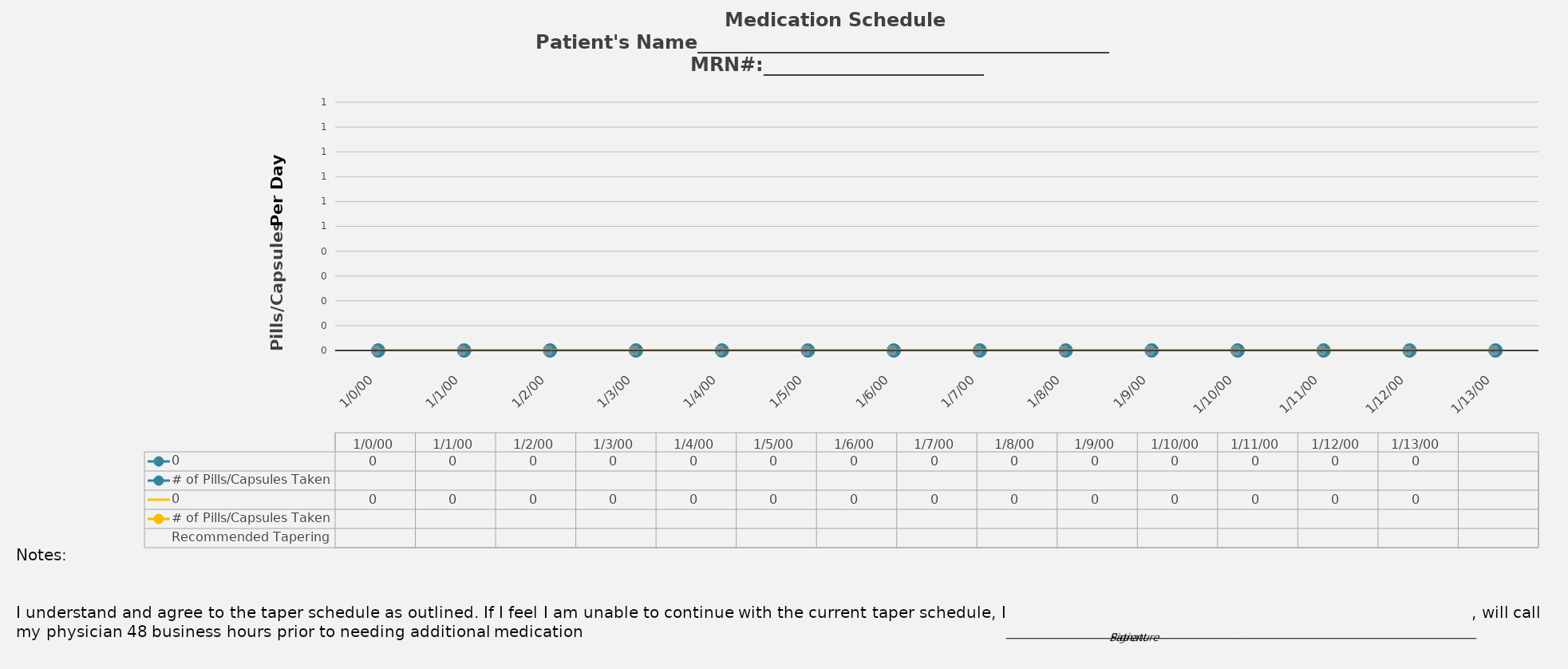
| Category | 0 | # of Pills/Capsules Taken | Recommended Tapering  |
|---|---|---|---|
| 0.0 | 0 |  |  |
| 1/1/00 | 0 |  |  |
| 1/2/00 | 0 |  |  |
| 1/3/00 | 0 |  |  |
| 1/4/00 | 0 |  |  |
| 1/5/00 | 0 |  |  |
| 1/6/00 | 0 |  |  |
| 1/7/00 | 0 |  |  |
| 1/8/00 | 0 |  |  |
| 1/9/00 | 0 |  |  |
| 1/10/00 | 0 |  |  |
| 1/11/00 | 0 |  |  |
| 1/12/00 | 0 |  |  |
| 1/13/00 | 0 |  |  |